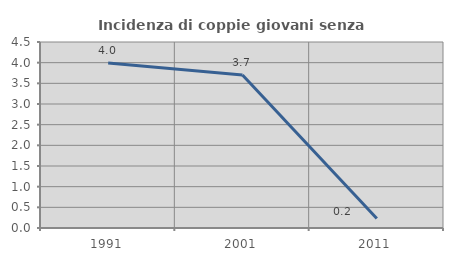
| Category | Incidenza di coppie giovani senza figli |
|---|---|
| 1991.0 | 3.992 |
| 2001.0 | 3.704 |
| 2011.0 | 0.231 |